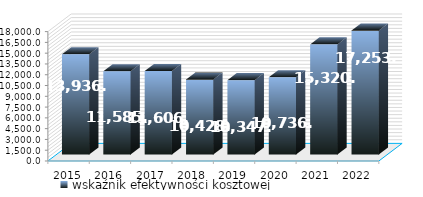
| Category | wskaźnik efektywności kosztowej |
|---|---|
| 2015.0 | 13936.626 |
| 2016.0 | 11585.453 |
| 2017.0 | 11606.618 |
| 2018.0 | 10428.116 |
| 2019.0 | 10347.874 |
| 2020.0 | 10736.482 |
| 2021.0 | 15320.116 |
| 2022.0 | 17253.479 |